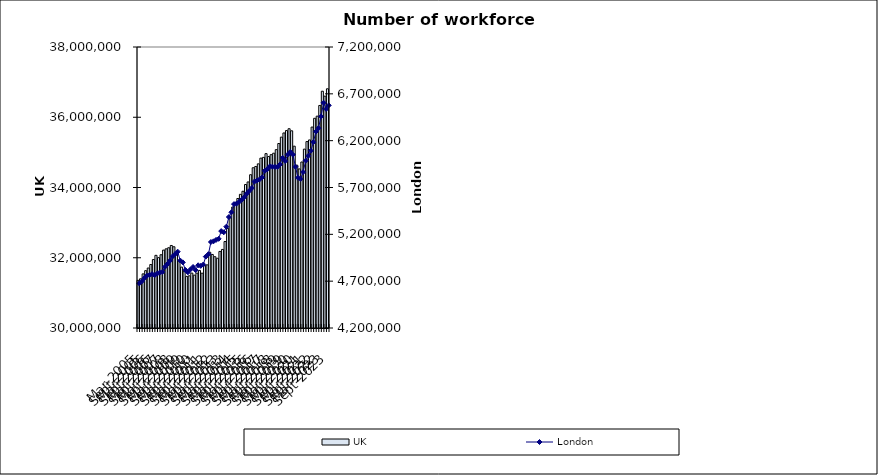
| Category | UK |
|---|---|
| 2005-03-01 | 31356909 |
| 2005-06-01 | 31400372 |
| 2005-09-01 | 31540488 |
| 2005-12-01 | 31632137 |
| 2006-03-01 | 31707847 |
| 2006-06-01 | 31806658 |
| 2006-09-01 | 31948764 |
| 2006-12-01 | 32068596 |
| 2007-03-01 | 32003515 |
| 2007-06-01 | 32084978 |
| 2007-09-01 | 32217653 |
| 2007-12-01 | 32253592 |
| 2008-03-01 | 32285022 |
| 2008-06-01 | 32349471 |
| 2008-09-01 | 32313094 |
| 2008-12-01 | 32123066 |
| 2009-03-01 | 31915111 |
| 2009-06-01 | 31733931 |
| 2009-09-01 | 31605302 |
| 2009-12-01 | 31469982 |
| 2010-03-01 | 31485690 |
| 2010-06-01 | 31562783 |
| 2010-09-01 | 31504710 |
| 2010-12-01 | 31561440 |
| 2011-03-01 | 31640072 |
| 2011-06-01 | 31560206 |
| 2011-09-01 | 31780431 |
| 2011-12-01 | 31797258 |
| 2012-03-01 | 32156416 |
| 2012-06-01 | 32093540 |
| 2012-09-01 | 32029579 |
| 2012-12-01 | 31985634 |
| 2013-03-01 | 32179577 |
| 2013-06-01 | 32236687 |
| 2013-09-01 | 32461453 |
| 2013-12-01 | 32832960 |
| 2014-03-01 | 33138165 |
| 2014-06-01 | 33444771 |
| 2014-09-01 | 33574459 |
| 2014-12-01 | 33686395 |
| 2015-03-01 | 33805489 |
| 2015-06-01 | 33892809 |
| 2015-09-01 | 34085001 |
| 2015-12-01 | 34158281 |
| 2016-03-01 | 34363694 |
| 2016-06-01 | 34562406 |
| 2016-09-01 | 34598364 |
| 2016-12-01 | 34673268 |
| 2017-03-01 | 34835946 |
| 2017-06-01 | 34858085 |
| 2017-09-01 | 34964270 |
| 2017-12-01 | 34881471 |
| 2018-03-01 | 34934460 |
| 2018-06-01 | 34976413 |
| 2018-09-01 | 35077928 |
| 2018-12-01 | 35252511 |
| 2019-03-01 | 35434110 |
| 2019-06-01 | 35552705 |
| 2019-09-01 | 35620848 |
| 2019-12-01 | 35673026 |
| 2020-03-01 | 35614260 |
| 2020-06-01 | 35176194 |
| 2020-09-01 | 34635513 |
| 2020-12-01 | 34529484 |
| 2021-03-01 | 34726377 |
| 2021-06-01 | 35092303 |
| 2021-09-01 | 35307336 |
| 2021-12-01 | 35353905 |
| 2022-03-01 | 35720441 |
| 2022-06-01 | 35969902 |
| 2022-09-01 | 36031486 |
| 2022-12-01 | 36335581 |
| 2023-03-01 | 36741390 |
| 2023-06-01 | 36600579 |
| 2023-09-01 | 36810332 |